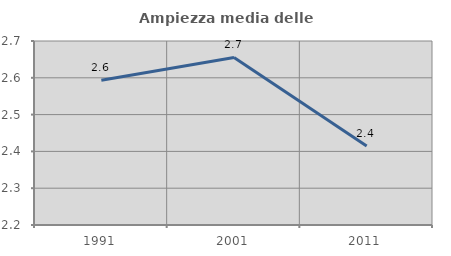
| Category | Ampiezza media delle famiglie |
|---|---|
| 1991.0 | 2.593 |
| 2001.0 | 2.655 |
| 2011.0 | 2.415 |